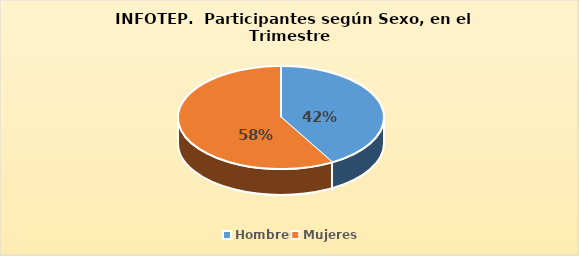
| Category | Series 0 |
|---|---|
| Hombres | 93575 |
| Mujeres | 130507 |